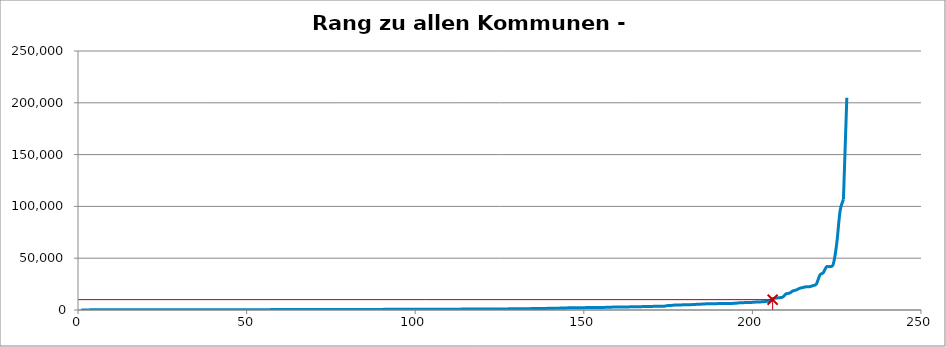
| Category | Kommunenrangfolge |
|---|---|
| 0 | 75 |
| 1 | 99 |
| 2 | 115 |
| 3 | 121 |
| 4 | 131 |
| 5 | 147 |
| 6 | 148 |
| 7 | 156 |
| 8 | 163 |
| 9 | 165 |
| 10 | 167 |
| 11 | 170 |
| 12 | 172 |
| 13 | 173 |
| 14 | 176 |
| 15 | 190 |
| 16 | 197 |
| 17 | 198 |
| 18 | 214 |
| 19 | 217 |
| 20 | 225 |
| 21 | 228 |
| 22 | 238 |
| 23 | 240 |
| 24 | 241 |
| 25 | 243 |
| 26 | 243 |
| 27 | 254 |
| 28 | 259 |
| 29 | 264 |
| 30 | 265 |
| 31 | 266 |
| 32 | 267 |
| 33 | 268 |
| 34 | 271 |
| 35 | 288 |
| 36 | 289 |
| 37 | 290 |
| 38 | 292 |
| 39 | 293 |
| 40 | 303 |
| 41 | 304 |
| 42 | 306 |
| 43 | 307 |
| 44 | 313 |
| 45 | 317 |
| 46 | 319 |
| 47 | 332 |
| 48 | 332 |
| 49 | 333 |
| 50 | 339 |
| 51 | 339 |
| 52 | 345 |
| 53 | 355 |
| 54 | 357 |
| 55 | 359 |
| 56 | 361 |
| 57 | 371 |
| 58 | 373 |
| 59 | 381 |
| 60 | 384 |
| 61 | 387 |
| 62 | 399 |
| 63 | 401 |
| 64 | 403 |
| 65 | 410 |
| 66 | 417 |
| 67 | 418 |
| 68 | 421 |
| 69 | 446 |
| 70 | 450 |
| 71 | 453 |
| 72 | 456 |
| 73 | 459 |
| 74 | 465 |
| 75 | 477 |
| 76 | 482 |
| 77 | 493 |
| 78 | 498 |
| 79 | 499 |
| 80 | 502 |
| 81 | 518 |
| 82 | 518 |
| 83 | 527 |
| 84 | 538 |
| 85 | 554 |
| 86 | 556 |
| 87 | 567 |
| 88 | 576 |
| 89 | 580 |
| 90 | 620 |
| 91 | 627 |
| 92 | 627 |
| 93 | 634 |
| 94 | 648 |
| 95 | 668 |
| 96 | 675 |
| 97 | 675 |
| 98 | 683 |
| 99 | 685 |
| 100 | 686 |
| 101 | 704 |
| 102 | 712 |
| 103 | 734 |
| 104 | 738 |
| 105 | 751 |
| 106 | 763 |
| 107 | 785 |
| 108 | 793 |
| 109 | 797 |
| 110 | 805 |
| 111 | 812 |
| 112 | 839 |
| 113 | 847 |
| 114 | 868 |
| 115 | 871 |
| 116 | 871 |
| 117 | 874 |
| 118 | 880 |
| 119 | 979 |
| 120 | 985 |
| 121 | 1005 |
| 122 | 1010 |
| 123 | 1010 |
| 124 | 1012 |
| 125 | 1026 |
| 126 | 1031 |
| 127 | 1116 |
| 128 | 1145 |
| 129 | 1186 |
| 130 | 1202 |
| 131 | 1223 |
| 132 | 1254 |
| 133 | 1304 |
| 134 | 1386 |
| 135 | 1392 |
| 136 | 1393 |
| 137 | 1503 |
| 138 | 1556 |
| 139 | 1622 |
| 140 | 1694 |
| 141 | 1697 |
| 142 | 1835 |
| 143 | 1991 |
| 144 | 2026 |
| 145 | 2157 |
| 146 | 2174 |
| 147 | 2216 |
| 148 | 2226 |
| 149 | 2250 |
| 150 | 2332 |
| 151 | 2373 |
| 152 | 2397 |
| 153 | 2414 |
| 154 | 2416 |
| 155 | 2501 |
| 156 | 2655 |
| 157 | 2740 |
| 158 | 2818 |
| 159 | 2869 |
| 160 | 2912 |
| 161 | 2964 |
| 162 | 2976 |
| 163 | 3049 |
| 164 | 3064 |
| 165 | 3084 |
| 166 | 3199 |
| 167 | 3414 |
| 168 | 3450 |
| 169 | 3478 |
| 170 | 3525 |
| 171 | 3658 |
| 172 | 3708 |
| 173 | 3743 |
| 174 | 4306 |
| 175 | 4445 |
| 176 | 4767 |
| 177 | 4835 |
| 178 | 4936 |
| 179 | 5026 |
| 180 | 5057 |
| 181 | 5192 |
| 182 | 5407 |
| 183 | 5479 |
| 184 | 5684 |
| 185 | 5894 |
| 186 | 5988 |
| 187 | 6096 |
| 188 | 6098 |
| 189 | 6170 |
| 190 | 6186 |
| 191 | 6204 |
| 192 | 6248 |
| 193 | 6362 |
| 194 | 6507 |
| 195 | 6895 |
| 196 | 7002 |
| 197 | 7226 |
| 198 | 7273 |
| 199 | 7374 |
| 200 | 7630 |
| 201 | 7725 |
| 202 | 7955 |
| 203 | 8247 |
| 204 | 8820 |
| 205 | 10961 |
| 206 | 11518 |
| 207 | 11866 |
| 208 | 12488 |
| 209 | 15600 |
| 210 | 16289 |
| 211 | 18389 |
| 212 | 19309 |
| 213 | 20900 |
| 214 | 21737 |
| 215 | 22436 |
| 216 | 22535 |
| 217 | 23571 |
| 218 | 25154 |
| 219 | 33703 |
| 220 | 35967 |
| 221 | 41744 |
| 222 | 41926 |
| 223 | 44517 |
| 224 | 63897 |
| 225 | 95551 |
| 226 | 106915 |
| 227 | 204880 |